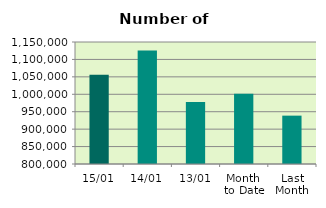
| Category | Series 0 |
|---|---|
| 15/01 | 1055834 |
| 14/01 | 1125424 |
| 13/01 | 977736 |
| Month 
to Date | 1001484.4 |
| Last
Month | 938735.9 |